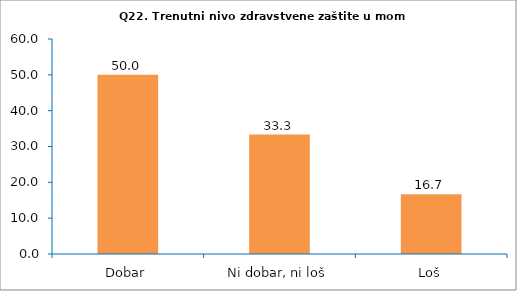
| Category | Series 0 |
|---|---|
| Dobar | 50 |
| Ni dobar, ni loš | 33.333 |
| Loš | 16.667 |